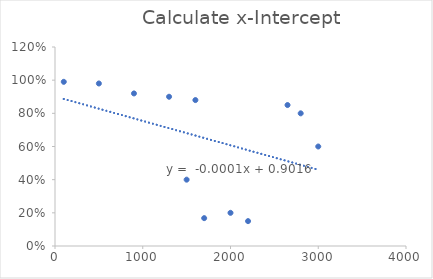
| Category | Calculate x-Intercept |
|---|---|
| 2000.0 | 0.2 |
| 2200.0 | 0.15 |
| 1700.0 | 0.168 |
| 1500.0 | 0.4 |
| 3000.0 | 0.6 |
| 2800.0 | 0.8 |
| 2650.0 | 0.85 |
| 1600.0 | 0.88 |
| 1300.0 | 0.9 |
| 900.0 | 0.92 |
| 500.0 | 0.98 |
| 100.0 | 0.99 |